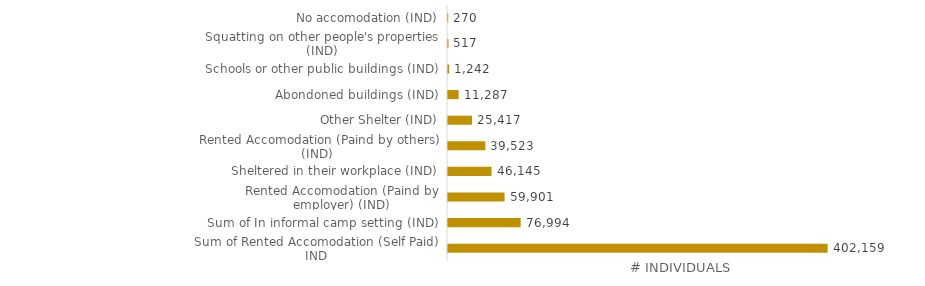
| Category | Series 0 |
|---|---|
| Sum of Rented Accomodation (Self Paid) IND | 402159 |
| Sum of In informal camp setting (IND) | 76994 |
| Rented Accomodation (Paind by employer) (IND) | 59901 |
| Sheltered in their workplace (IND) | 46145 |
| Rented Accomodation (Paind by others) (IND)  | 39523 |
| Other Shelter (IND) | 25417 |
| Abondoned buildings (IND) | 11287 |
| Schools or other public buildings (IND) | 1242 |
| Squatting on other people's properties (IND) | 517 |
| No accomodation (IND) | 270 |